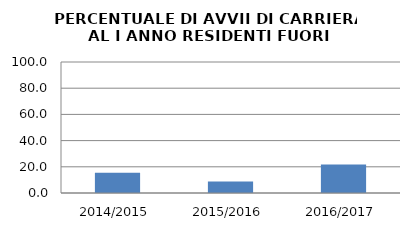
| Category | 2014/2015 2015/2016 2016/2017 |
|---|---|
| 2014/2015 | 15.385 |
| 2015/2016 | 8.772 |
| 2016/2017 | 21.818 |